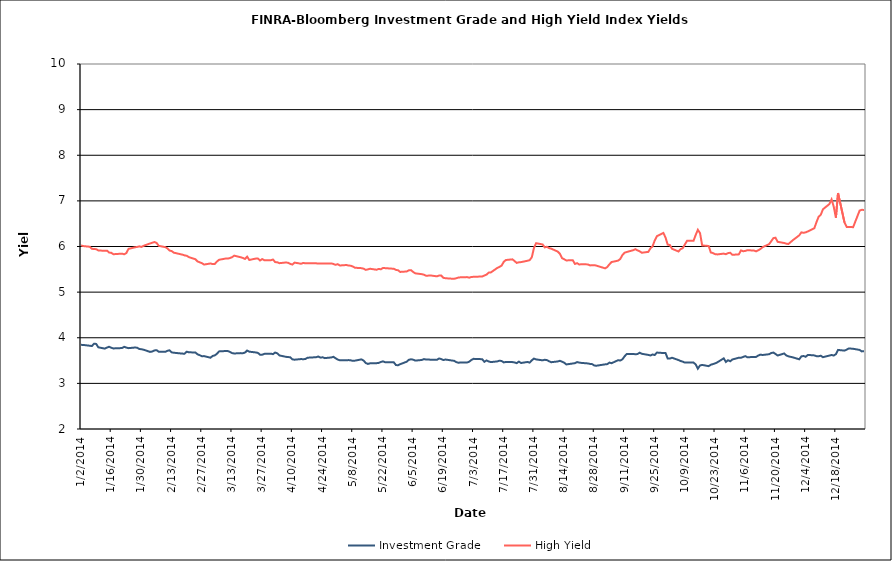
| Category | Investment Grade | High Yield |
|---|---|---|
| 1/2/14 | 3.844 | 6.025 |
| 1/3/14 | 3.842 | 6.009 |
| 1/6/14 | 3.825 | 5.995 |
| 1/7/14 | 3.818 | 5.951 |
| 1/8/14 | 3.87 | 5.943 |
| 1/9/14 | 3.864 | 5.942 |
| 1/10/14 | 3.79 | 5.914 |
| 1/13/14 | 3.762 | 5.905 |
| 1/14/14 | 3.784 | 5.909 |
| 1/15/14 | 3.803 | 5.867 |
| 1/16/14 | 3.78 | 5.861 |
| 1/17/14 | 3.766 | 5.831 |
| 1/21/14 | 3.774 | 5.843 |
| 1/22/14 | 3.801 | 5.829 |
| 1/23/14 | 3.784 | 5.857 |
| 1/24/14 | 3.772 | 5.948 |
| 1/27/14 | 3.786 | 5.982 |
| 1/28/14 | 3.782 | 5.991 |
| 1/29/14 | 3.754 | 6.003 |
| 1/30/14 | 3.748 | 5.991 |
| 1/31/14 | 3.738 | 6.016 |
| 2/3/14 | 3.69 | 6.066 |
| 2/4/14 | 3.699 | 6.082 |
| 2/5/14 | 3.722 | 6.098 |
| 2/6/14 | 3.728 | 6.079 |
| 2/7/14 | 3.695 | 6.015 |
| 2/10/14 | 3.691 | 5.986 |
| 2/11/14 | 3.713 | 5.962 |
| 2/12/14 | 3.724 | 5.911 |
| 2/13/14 | 3.68 | 5.9 |
| 2/14/14 | 3.672 | 5.865 |
| 2/18/14 | 3.652 | 5.821 |
| 2/19/14 | 3.651 | 5.805 |
| 2/20/14 | 3.695 | 5.797 |
| 2/21/14 | 3.681 | 5.767 |
| 2/24/14 | 3.677 | 5.721 |
| 2/25/14 | 3.637 | 5.673 |
| 2/26/14 | 3.618 | 5.653 |
| 2/27/14 | 3.595 | 5.636 |
| 2/28/14 | 3.598 | 5.604 |
| 3/3/14 | 3.563 | 5.628 |
| 3/4/14 | 3.601 | 5.616 |
| 3/5/14 | 3.613 | 5.618 |
| 3/6/14 | 3.649 | 5.671 |
| 3/7/14 | 3.701 | 5.709 |
| 3/10/14 | 3.709 | 5.736 |
| 3/11/14 | 3.709 | 5.734 |
| 3/12/14 | 3.691 | 5.747 |
| 3/13/14 | 3.664 | 5.765 |
| 3/14/14 | 3.655 | 5.799 |
| 3/17/14 | 3.663 | 5.765 |
| 3/18/14 | 3.661 | 5.749 |
| 3/19/14 | 3.675 | 5.728 |
| 3/20/14 | 3.72 | 5.777 |
| 3/21/14 | 3.695 | 5.705 |
| 3/24/14 | 3.678 | 5.735 |
| 3/25/14 | 3.669 | 5.735 |
| 3/26/14 | 3.626 | 5.694 |
| 3/27/14 | 3.629 | 5.724 |
| 3/28/14 | 3.647 | 5.698 |
| 3/31/14 | 3.652 | 5.7 |
| 4/1/14 | 3.641 | 5.714 |
| 4/2/14 | 3.676 | 5.658 |
| 4/3/14 | 3.658 | 5.653 |
| 4/4/14 | 3.612 | 5.634 |
| 4/7/14 | 3.582 | 5.65 |
| 4/8/14 | 3.577 | 5.642 |
| 4/9/14 | 3.572 | 5.618 |
| 4/10/14 | 3.527 | 5.604 |
| 4/11/14 | 3.519 | 5.647 |
| 4/14/14 | 3.533 | 5.622 |
| 4/15/14 | 3.529 | 5.639 |
| 4/16/14 | 3.534 | 5.633 |
| 4/17/14 | 3.562 | 5.633 |
| 4/21/14 | 3.574 | 5.631 |
| 4/22/14 | 3.588 | 5.628 |
| 4/23/14 | 3.564 | 5.628 |
| 4/24/14 | 3.572 | 5.628 |
| 4/25/14 | 3.554 | 5.625 |
| 4/28/14 | 3.568 | 5.63 |
| 4/29/14 | 3.582 | 5.617 |
| 4/30/14 | 3.551 | 5.598 |
| 5/1/14 | 3.522 | 5.612 |
| 5/2/14 | 3.506 | 5.584 |
| 5/5/14 | 3.507 | 5.594 |
| 5/6/14 | 3.51 | 5.583 |
| 5/7/14 | 3.506 | 5.579 |
| 5/8/14 | 3.493 | 5.562 |
| 5/9/14 | 3.498 | 5.534 |
| 5/12/14 | 3.526 | 5.525 |
| 5/13/14 | 3.501 | 5.514 |
| 5/14/14 | 3.446 | 5.488 |
| 5/15/14 | 3.426 | 5.499 |
| 5/16/14 | 3.439 | 5.512 |
| 5/19/14 | 3.443 | 5.491 |
| 5/20/14 | 3.448 | 5.508 |
| 5/21/14 | 3.47 | 5.5 |
| 5/22/14 | 3.482 | 5.53 |
| 5/23/14 | 3.463 | 5.526 |
| 5/27/14 | 3.462 | 5.512 |
| 5/28/14 | 3.401 | 5.487 |
| 5/29/14 | 3.398 | 5.479 |
| 5/30/14 | 3.421 | 5.443 |
| 6/2/14 | 3.475 | 5.453 |
| 6/3/14 | 3.517 | 5.48 |
| 6/4/14 | 3.528 | 5.481 |
| 6/5/14 | 3.519 | 5.441 |
| 6/6/14 | 3.499 | 5.411 |
| 6/9/14 | 3.513 | 5.394 |
| 6/10/14 | 3.532 | 5.381 |
| 6/11/14 | 3.523 | 5.359 |
| 6/12/14 | 3.523 | 5.362 |
| 6/13/14 | 3.519 | 5.366 |
| 6/16/14 | 3.516 | 5.346 |
| 6/17/14 | 3.546 | 5.364 |
| 6/18/14 | 3.533 | 5.363 |
| 6/19/14 | 3.511 | 5.314 |
| 6/20/14 | 3.523 | 5.304 |
| 6/23/14 | 3.501 | 5.294 |
| 6/24/14 | 3.494 | 5.293 |
| 6/25/14 | 3.465 | 5.304 |
| 6/26/14 | 3.453 | 5.321 |
| 6/27/14 | 3.457 | 5.324 |
| 6/30/14 | 3.458 | 5.329 |
| 7/1/14 | 3.475 | 5.317 |
| 7/2/14 | 3.514 | 5.332 |
| 7/3/14 | 3.538 | 5.336 |
| 7/7/14 | 3.53 | 5.343 |
| 7/8/14 | 3.473 | 5.364 |
| 7/9/14 | 3.502 | 5.384 |
| 7/10/14 | 3.481 | 5.427 |
| 7/11/14 | 3.466 | 5.431 |
| 7/14/14 | 3.482 | 5.531 |
| 7/15/14 | 3.497 | 5.553 |
| 7/16/14 | 3.49 | 5.582 |
| 7/17/14 | 3.459 | 5.665 |
| 7/18/14 | 3.469 | 5.704 |
| 7/21/14 | 3.467 | 5.719 |
| 7/22/14 | 3.458 | 5.682 |
| 7/23/14 | 3.443 | 5.641 |
| 7/24/14 | 3.478 | 5.654 |
| 7/25/14 | 3.446 | 5.658 |
| 7/28/14 | 3.469 | 5.688 |
| 7/29/14 | 3.455 | 5.7 |
| 7/30/14 | 3.506 | 5.764 |
| 7/31/14 | 3.543 | 5.968 |
| 8/1/14 | 3.525 | 6.073 |
| 8/4/14 | 3.505 | 6.045 |
| 8/5/14 | 3.517 | 5.981 |
| 8/6/14 | 3.51 | 5.994 |
| 8/7/14 | 3.485 | 5.965 |
| 8/8/14 | 3.464 | 5.953 |
| 8/11/14 | 3.48 | 5.889 |
| 8/12/14 | 3.494 | 5.843 |
| 8/13/14 | 3.476 | 5.746 |
| 8/14/14 | 3.454 | 5.721 |
| 8/15/14 | 3.415 | 5.695 |
| 8/18/14 | 3.436 | 5.699 |
| 8/19/14 | 3.443 | 5.618 |
| 8/20/14 | 3.467 | 5.635 |
| 8/21/14 | 3.456 | 5.605 |
| 8/22/14 | 3.449 | 5.612 |
| 8/25/14 | 3.437 | 5.607 |
| 8/26/14 | 3.427 | 5.585 |
| 8/27/14 | 3.422 | 5.589 |
| 8/28/14 | 3.39 | 5.591 |
| 8/29/14 | 3.388 | 5.58 |
| 9/2/14 | 3.417 | 5.521 |
| 9/3/14 | 3.422 | 5.55 |
| 9/4/14 | 3.455 | 5.611 |
| 9/5/14 | 3.442 | 5.659 |
| 9/8/14 | 3.508 | 5.69 |
| 9/9/14 | 3.502 | 5.725 |
| 9/10/14 | 3.526 | 5.811 |
| 9/11/14 | 3.592 | 5.863 |
| 9/12/14 | 3.644 | 5.879 |
| 9/15/14 | 3.645 | 5.918 |
| 9/16/14 | 3.638 | 5.941 |
| 9/17/14 | 3.642 | 5.916 |
| 9/18/14 | 3.672 | 5.895 |
| 9/19/14 | 3.648 | 5.863 |
| 9/22/14 | 3.624 | 5.882 |
| 9/23/14 | 3.611 | 5.959 |
| 9/24/14 | 3.634 | 6.004 |
| 9/25/14 | 3.622 | 6.133 |
| 9/26/14 | 3.675 | 6.226 |
| 9/29/14 | 3.665 | 6.297 |
| 9/30/14 | 3.666 | 6.198 |
| 10/1/14 | 3.546 | 6.041 |
| 10/2/14 | 3.543 | 6.033 |
| 10/3/14 | 3.562 | 5.951 |
| 10/6/14 | 3.511 | 5.891 |
| 10/7/14 | 3.49 | 5.942 |
| 10/8/14 | 3.476 | 5.966 |
| 10/9/14 | 3.455 | 6.047 |
| 10/10/14 | 3.455 | 6.125 |
| 10/13/14 | 3.455 | 6.126 |
| 10/14/14 | 3.415 | 6.254 |
| 10/15/14 | 3.322 | 6.366 |
| 10/16/14 | 3.392 | 6.295 |
| 10/17/14 | 3.405 | 6.024 |
| 10/20/14 | 3.378 | 6.011 |
| 10/21/14 | 3.408 | 5.869 |
| 10/22/14 | 3.423 | 5.856 |
| 10/23/14 | 3.438 | 5.833 |
| 10/24/14 | 3.46 | 5.826 |
| 10/27/14 | 3.549 | 5.844 |
| 10/28/14 | 3.47 | 5.831 |
| 10/29/14 | 3.508 | 5.854 |
| 10/30/14 | 3.484 | 5.863 |
| 10/31/14 | 3.523 | 5.818 |
| 11/3/14 | 3.563 | 5.828 |
| 11/4/14 | 3.561 | 5.914 |
| 11/5/14 | 3.58 | 5.896 |
| 11/6/14 | 3.597 | 5.904 |
| 11/7/14 | 3.571 | 5.919 |
| 11/10/14 | 3.581 | 5.911 |
| 11/11/14 | 3.58 | 5.894 |
| 11/12/14 | 3.61 | 5.917 |
| 11/13/14 | 3.63 | 5.944 |
| 11/14/14 | 3.622 | 5.986 |
| 11/17/14 | 3.639 | 6.05 |
| 11/18/14 | 3.664 | 6.114 |
| 11/19/14 | 3.676 | 6.183 |
| 11/20/14 | 3.645 | 6.193 |
| 11/21/14 | 3.61 | 6.102 |
| 11/24/14 | 3.655 | 6.077 |
| 11/25/14 | 3.614 | 6.062 |
| 11/26/14 | 3.592 | 6.055 |
| 11/28/14 | 3.571 | 6.136 |
| 12/1/14 | 3.527 | 6.244 |
| 12/2/14 | 3.592 | 6.31 |
| 12/3/14 | 3.6 | 6.3 |
| 12/4/14 | 3.583 | 6.311 |
| 12/5/14 | 3.624 | 6.33 |
| 12/8/14 | 3.613 | 6.401 |
| 12/9/14 | 3.596 | 6.533 |
| 12/10/14 | 3.594 | 6.652 |
| 12/11/14 | 3.607 | 6.697 |
| 12/12/14 | 3.574 | 6.816 |
| 12/15/14 | 3.61 | 6.93 |
| 12/16/14 | 3.622 | 7.031 |
| 12/17/14 | 3.611 | 6.874 |
| 12/18/14 | 3.64 | 6.631 |
| 12/19/14 | 3.733 | 7.172 |
| 12/22/14 | 3.718 | 6.524 |
| 12/23/14 | 3.739 | 6.429 |
| 12/24/14 | 3.766 | 6.426 |
| 12/26/14 | 3.758 | 6.424 |
| 12/29/14 | 3.733 | 6.787 |
| 12/30/14 | 3.701 | 6.803 |
| 12/31/14 | 3.703 | 6.802 |